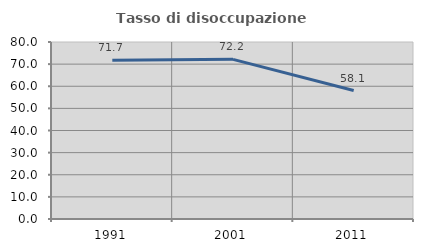
| Category | Tasso di disoccupazione giovanile  |
|---|---|
| 1991.0 | 71.724 |
| 2001.0 | 72.152 |
| 2011.0 | 58.065 |